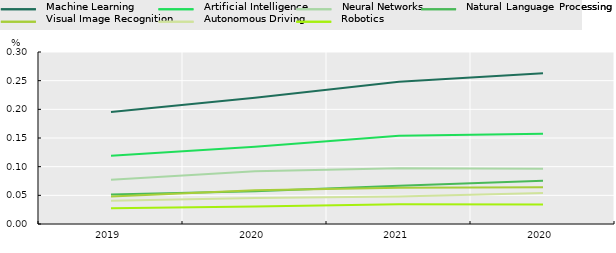
| Category | Machine Learning | Artificial Intelligence | Neural Networks | Natural Language Processing | Visual Image Recognition | Autonomous Driving | Robotics |
|---|---|---|---|---|---|---|---|
| 2019.0 | 0.195 | 0.119 | 0.077 | 0.052 | 0.048 | 0.041 | 0.028 |
| 2020.0 | 0.22 | 0.135 | 0.092 | 0.057 | 0.059 | 0.045 | 0.031 |
| 2021.0 | 0.248 | 0.154 | 0.097 | 0.067 | 0.063 | 0.048 | 0.034 |
| 2020.0 | 0.263 | 0.157 | 0.096 | 0.075 | 0.064 | 0.054 | 0.034 |